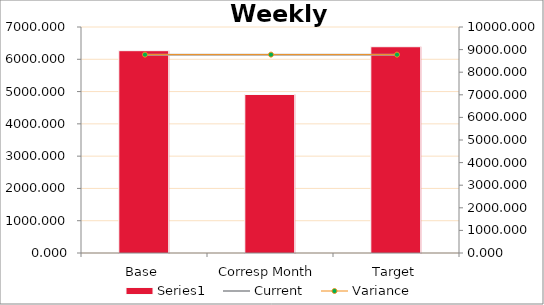
| Category | Series 0 |
|---|---|
| Base | 6266.495 |
| Corresp Month | 4908.91 |
| Target | 6389.109 |